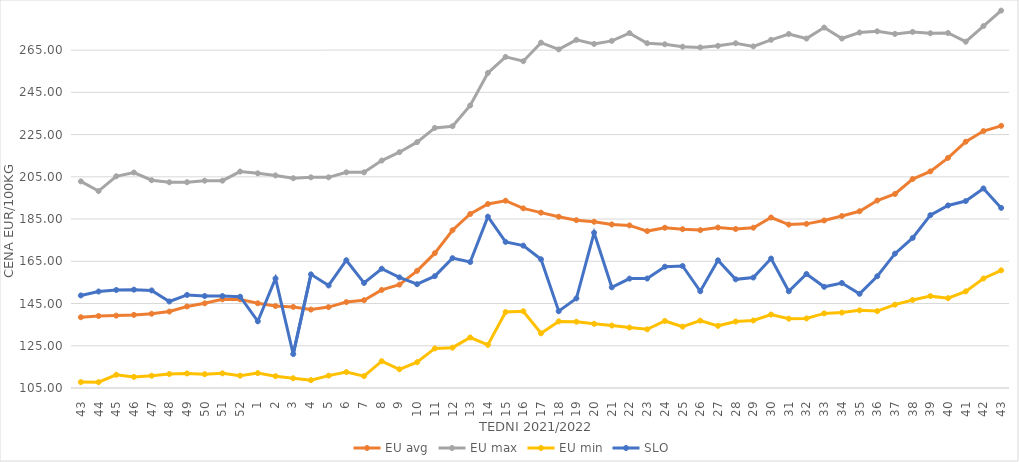
| Category | EU avg | EU max | EU min | SLO |
|---|---|---|---|---|
| 43.0 | 138.52 | 202.856 | 107.8 | 148.83 |
| 44.0 | 139.076 | 198.26 | 107.75 | 150.69 |
| 45.0 | 139.275 | 205.257 | 111.25 | 151.41 |
| 46.0 | 139.626 | 207.046 | 110.26 | 151.56 |
| 47.0 | 140.17 | 203.387 | 110.83 | 151.2 |
| 48.0 | 141.2 | 202.42 | 111.62 | 145.97 |
| 49.0 | 143.614 | 202.45 | 111.89 | 149.07 |
| 50.0 | 145.101 | 203.17 | 111.54 | 148.55 |
| 51.0 | 146.984 | 203.17 | 111.93 | 148.54 |
| 52.0 | 146.958 | 207.5 | 110.85 | 148.22 |
| 1.0 | 145.11 | 206.66 | 112.04 | 136.59 |
| 2.0 | 143.822 | 205.67 | 110.59 | 156.88 |
| 3.0 | 143.402 | 204.34 | 109.62 | 121.07 |
| 4.0 | 142.134 | 204.76 | 108.71 | 158.82 |
| 5.0 | 143.314 | 204.76 | 110.86 | 153.55 |
| 6.0 | 145.677 | 207.14 | 112.52 | 165.51 |
| 7.0 | 146.556 | 207.14 | 110.619 | 154.74 |
| 8.0 | 151.439 | 212.7 | 117.709 | 161.48 |
| 9.0 | 153.947 | 216.67 | 113.871 | 157.38 |
| 10.0 | 160.496 | 221.43 | 117.233 | 154.16 |
| 11.0 | 168.845 | 228.17 | 123.737 | 157.96 |
| 12.0 | 179.714 | 228.97 | 124.105 | 166.49 |
| 13.0 | 187.409 | 238.81 | 128.918 | 164.66 |
| 14.0 | 192.137 | 254.21 | 125.399 | 186.11 |
| 15.0 | 193.697 | 261.79 | 140.954 | 174.18 |
| 16.0 | 190.066 | 259.76 | 141.337 | 172.42 |
| 17.0 | 188.031 | 268.52 | 130.897 | 165.96 |
| 18.0 | 186.119 | 265.34 | 136.529 | 141.36 |
| 19.0 | 184.47 | 269.87 | 136.387 | 147.43 |
| 20.0 | 183.734 | 267.92 | 135.392 | 178.51 |
| 21.0 | 182.45 | 269.38 | 134.589 | 152.67 |
| 22.0 | 181.991 | 273.06 | 133.621 | 156.8 |
| 23.0 | 179.308 | 268.27 | 132.787 | 156.84 |
| 24.0 | 180.886 | 267.77 | 136.75 | 162.44 |
| 25.0 | 180.2 | 266.63 | 134.058 | 162.78 |
| 26.0 | 179.77 | 266.27 | 136.895 | 150.82 |
| 27.0 | 180.992 | 267.02 | 134.44 | 165.45 |
| 28.0 | 180.305 | 268.25 | 136.486 | 156.46 |
| 29.0 | 180.913 | 266.77 | 136.97 | 157.31 |
| 30.0 | 185.728 | 269.87 | 139.777 | 166.29 |
| 31.0 | 182.385 | 272.64 | 137.828 | 150.81 |
| 32.0 | 182.73 | 270.47 | 137.934 | 158.99 |
| 33.0 | 184.343 | 275.68 | 140.33 | 152.91 |
| 34.0 | 186.448 | 270.49 | 140.7 | 154.73 |
| 35.0 | 188.684 | 273.33 | 141.78 | 149.6 |
| 36.0 | 193.792 | 273.91 | 141.41 | 157.93 |
| 37.0 | 196.877 | 272.67 | 144.47 | 168.61 |
| 38.0 | 203.962 | 273.63 | 146.68 | 176.07 |
| 39.0 | 207.572 | 272.98 | 148.499 | 186.86 |
| 40.0 | 213.977 | 273.1 | 147.54 | 191.45 |
| 41.0 | 221.625 | 268.98 | 150.75 | 193.52 |
| 42.0 | 226.676 | 276.39 | 156.848 | 199.51 |
| 43.0 | 229.157 | 283.71 | 160.73 | 190.28 |